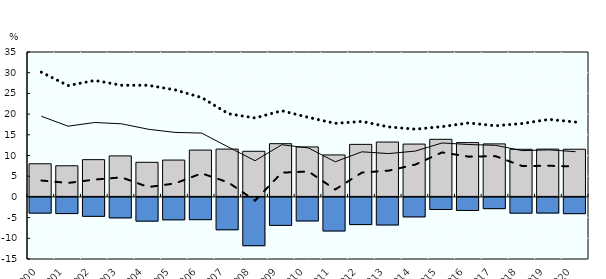
| Category | of which are budgetary payments and positive MPS | of which are negative MPS |
|---|---|---|
| 0 | 7.997 | -4.039 |
| 1 | 7.52 | -4.149 |
| 2 | 8.997 | -4.814 |
| 3 | 9.904 | -5.19 |
| 4 | 8.358 | -5.977 |
| 5 | 8.897 | -5.659 |
| 6 | 11.308 | -5.615 |
| 7 | 11.55 | -8.062 |
| 8 | 11.016 | -11.908 |
| 9 | 12.855 | -7 |
| 10 | 12.073 | -5.934 |
| 11 | 10.14 | -8.355 |
| 12 | 12.69 | -6.81 |
| 13 | 13.247 | -6.903 |
| 14 | 12.76 | -4.947 |
| 15 | 13.908 | -3.161 |
| 16 | 13.115 | -3.395 |
| 17 | 12.807 | -2.957 |
| 18 | 11.502 | -4.049 |
| 19 | 11.541 | -4.021 |
| 20 | 11.517 | -4.167 |